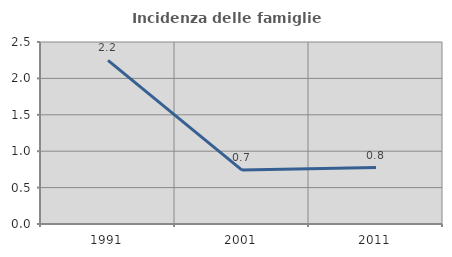
| Category | Incidenza delle famiglie numerose |
|---|---|
| 1991.0 | 2.247 |
| 2001.0 | 0.741 |
| 2011.0 | 0.775 |